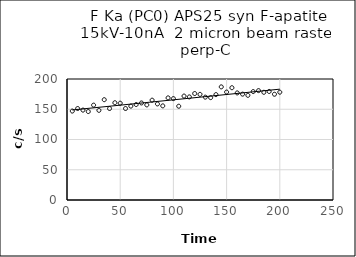
| Category | Series 0 |
|---|---|
| 5.0 | 147 |
| 10.0 | 151.2 |
| 15.0 | 148.6 |
| 20.0 | 146.2 |
| 25.0 | 156.8 |
| 30.0 | 148.2 |
| 35.0 | 165.8 |
| 40.0 | 151.2 |
| 45.0 | 160.8 |
| 50.0 | 160 |
| 55.0 | 151.2 |
| 60.0 | 155.2 |
| 65.0 | 157.8 |
| 70.0 | 160.4 |
| 75.0 | 157.2 |
| 80.0 | 165 |
| 85.0 | 158.8 |
| 90.0 | 155.6 |
| 95.0 | 168.8 |
| 100.0 | 167.6 |
| 105.0 | 155 |
| 110.0 | 171.8 |
| 115.0 | 170.4 |
| 120.0 | 176 |
| 125.0 | 174.6 |
| 130.0 | 170 |
| 135.0 | 169.2 |
| 140.0 | 174.2 |
| 145.0 | 187 |
| 150.0 | 178.4 |
| 155.0 | 185.6 |
| 160.0 | 177 |
| 165.0 | 175 |
| 170.0 | 173 |
| 175.0 | 179.2 |
| 180.0 | 180.8 |
| 185.0 | 178 |
| 190.0 | 179.4 |
| 195.0 | 174.8 |
| 200.0 | 178.2 |